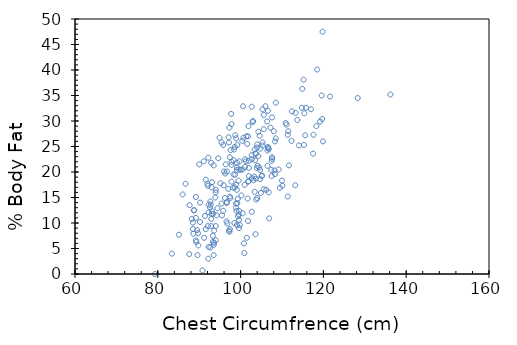
| Category | Series 0 |
|---|---|
| 93.1 | 12.3 |
| 93.6 | 6.1 |
| 95.8 | 25.3 |
| 101.8 | 10.4 |
| 97.3 | 28.7 |
| 104.5 | 20.9 |
| 105.1 | 19.2 |
| 99.6 | 12.4 |
| 100.9 | 4.1 |
| 99.6 | 11.7 |
| 101.5 | 7.1 |
| 103.6 | 7.8 |
| 102.0 | 20.8 |
| 104.1 | 21.2 |
| 101.3 | 22.1 |
| 99.1 | 20.9 |
| 101.9 | 29 |
| 107.6 | 22.9 |
| 106.8 | 16 |
| 106.2 | 16.5 |
| 103.3 | 19.1 |
| 111.4 | 15.2 |
| 86.0 | 15.6 |
| 86.7 | 17.7 |
| 90.2 | 14 |
| 89.6 | 3.7 |
| 88.6 | 7.9 |
| 97.4 | 22.9 |
| 93.5 | 3.7 |
| 97.4 | 8.8 |
| 100.5 | 11.9 |
| 93.5 | 5.7 |
| 93.0 | 11.8 |
| 111.7 | 21.3 |
| 117.0 | 32.3 |
| 118.5 | 40.1 |
| 106.5 | 24.2 |
| 105.6 | 28.4 |
| 136.2 | 35.2 |
| 114.8 | 32.6 |
| 128.3 | 34.5 |
| 106.0 | 32.9 |
| 113.3 | 31.6 |
| 106.6 | 32 |
| 85.1 | 7.7 |
| 96.6 | 13.9 |
| 88.2 | 10.8 |
| 89.8 | 5.6 |
| 92.3 | 13.6 |
| 83.4 | 4 |
| 90.2 | 10.2 |
| 89.2 | 6.6 |
| 89.7 | 8 |
| 93.3 | 6.3 |
| 87.6 | 3.9 |
| 107.6 | 22.6 |
| 100.0 | 20.4 |
| 111.5 | 28 |
| 115.4 | 31.5 |
| 104.8 | 24.6 |
| 112.3 | 26.1 |
| 102.9 | 29.8 |
| 107.6 | 30.7 |
| 105.3 | 25.8 |
| 105.3 | 32.3 |
| 103.0 | 30 |
| 90.0 | 21.5 |
| 95.4 | 13.8 |
| 89.3 | 6.3 |
| 94.4 | 12.9 |
| 97.6 | 24.3 |
| 88.5 | 8.8 |
| 93.6 | 8.5 |
| 87.7 | 13.5 |
| 93.4 | 11.8 |
| 91.6 | 18.5 |
| 91.6 | 8.8 |
| 102.0 | 22.2 |
| 96.4 | 21.5 |
| 102.7 | 18.8 |
| 97.7 | 31.4 |
| 97.1 | 26.8 |
| 103.1 | 18.4 |
| 101.8 | 27 |
| 101.4 | 27 |
| 98.9 | 26.6 |
| 97.5 | 14.9 |
| 104.3 | 23.1 |
| 97.3 | 8.3 |
| 96.7 | 14.1 |
| 99.7 | 20.5 |
| 101.9 | 18.2 |
| 97.2 | 8.5 |
| 106.6 | 24.9 |
| 99.6 | 9 |
| 113.2 | 17.4 |
| 99.1 | 9.6 |
| 99.4 | 11.3 |
| 95.1 | 17.8 |
| 107.5 | 22.2 |
| 106.5 | 21.2 |
| 99.1 | 20.4 |
| 96.7 | 20.1 |
| 103.5 | 22.3 |
| 104.0 | 25.4 |
| 93.1 | 18 |
| 105.2 | 19.3 |
| 110.0 | 18.3 |
| 110.1 | 17.3 |
| 97.8 | 21.4 |
| 96.3 | 19.7 |
| 108.0 | 28 |
| 99.7 | 22.1 |
| 93.5 | 21.3 |
| 100.7 | 26.7 |
| 97.0 | 16.7 |
| 96.0 | 20.1 |
| 99.2 | 13.9 |
| 95.4 | 25.8 |
| 101.8 | 18.1 |
| 104.3 | 27.9 |
| 99.2 | 25.3 |
| 99.3 | 14.7 |
| 94.0 | 16 |
| 98.9 | 13.8 |
| 101.0 | 17.5 |
| 98.7 | 27.2 |
| 95.9 | 17.4 |
| 103.9 | 20.8 |
| 96.2 | 14.9 |
| 97.8 | 18.1 |
| 94.6 | 22.7 |
| 103.6 | 23.6 |
| 100.4 | 26.1 |
| 98.4 | 24.4 |
| 104.6 | 27.1 |
| 92.9 | 21.8 |
| 97.8 | 29.4 |
| 98.3 | 22.3 |
| 104.7 | 20.4 |
| 98.6 | 24.9 |
| 99.5 | 18.3 |
| 102.7 | 23.3 |
| 92.1 | 9.4 |
| 96.6 | 10.3 |
| 92.7 | 14.2 |
| 102.0 | 19.2 |
| 110.9 | 29.6 |
| 92.3 | 5.3 |
| 114.1 | 25.2 |
| 92.9 | 9.4 |
| 108.3 | 19.6 |
| 88.5 | 10.1 |
| 94.0 | 16.5 |
| 101.1 | 21 |
| 92.1 | 17.3 |
| 105.6 | 31.2 |
| 98.5 | 10 |
| 88.7 | 12.5 |
| 101.1 | 22.5 |
| 94.0 | 9.4 |
| 103.8 | 14.6 |
| 98.9 | 13 |
| 89.2 | 15.1 |
| 111.4 | 27.3 |
| 107.5 | 19.2 |
| 99.1 | 21.8 |
| 108.2 | 20.3 |
| 114.9 | 36.3 |
| 99.1 | 16.5 |
| 92.2 | 3 |
| 90.8 | 0.7 |
| 100.5 | 20.5 |
| 98.2 | 16.9 |
| 115.3 | 25.3 |
| 96.8 | 9.9 |
| 92.6 | 13.1 |
| 119.2 | 29.9 |
| 102.7 | 22.5 |
| 109.5 | 16.9 |
| 108.5 | 26.6 |
| 79.3 | 0 |
| 95.5 | 11.5 |
| 92.3 | 12.1 |
| 98.9 | 17.5 |
| 89.5 | 8.6 |
| 117.5 | 23.6 |
| 107.4 | 20.4 |
| 109.2 | 20.5 |
| 103.4 | 24.4 |
| 91.4 | 11.4 |
| 115.2 | 38.1 |
| 104.9 | 15.9 |
| 106.7 | 24.7 |
| 92.2 | 22.8 |
| 101.6 | 25.5 |
| 97.8 | 22 |
| 92.0 | 17.7 |
| 94.0 | 6.6 |
| 103.7 | 23.6 |
| 102.7 | 12.2 |
| 91.1 | 22.1 |
| 107.2 | 28.7 |
| 100.8 | 6 |
| 121.6 | 34.8 |
| 105.6 | 16.6 |
| 100.6 | 32.9 |
| 102.7 | 32.8 |
| 99.8 | 9.6 |
| 92.9 | 10.8 |
| 91.2 | 7.1 |
| 115.6 | 27.2 |
| 98.3 | 19.5 |
| 103.7 | 18.7 |
| 98.7 | 19.5 |
| 119.8 | 47.5 |
| 92.8 | 13.6 |
| 93.3 | 7.5 |
| 106.8 | 24.5 |
| 93.9 | 15 |
| 99.0 | 12.4 |
| 119.9 | 26 |
| 94.2 | 11.5 |
| 92.7 | 5.2 |
| 106.9 | 10.9 |
| 88.8 | 12.5 |
| 101.7 | 14.8 |
| 105.3 | 25.2 |
| 104.0 | 14.9 |
| 98.6 | 17 |
| 99.6 | 10.6 |
| 103.4 | 16.1 |
| 100.2 | 15.4 |
| 94.9 | 26.7 |
| 97.2 | 25.8 |
| 104.7 | 18.6 |
| 104.0 | 24.8 |
| 117.6 | 27.3 |
| 95.8 | 12.4 |
| 106.4 | 29.9 |
| 93.0 | 17 |
| 119.6 | 35 |
| 119.7 | 30.4 |
| 115.8 | 32.6 |
| 118.3 | 29 |
| 97.4 | 15.2 |
| 113.7 | 30.2 |
| 89.2 | 11 |
| 108.5 | 33.6 |
| 111.1 | 29.3 |
| 108.3 | 26 |
| 112.4 | 31.9 |